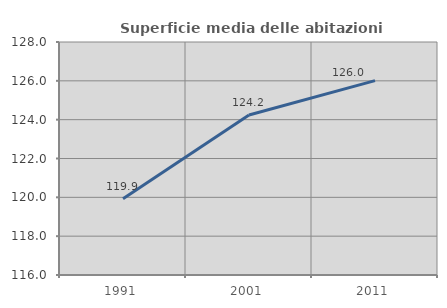
| Category | Superficie media delle abitazioni occupate |
|---|---|
| 1991.0 | 119.924 |
| 2001.0 | 124.239 |
| 2011.0 | 126.009 |